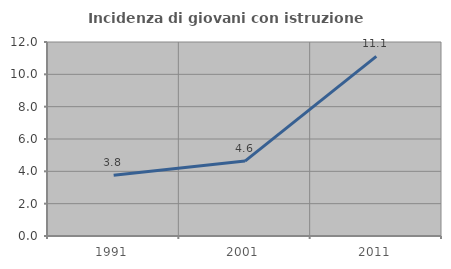
| Category | Incidenza di giovani con istruzione universitaria |
|---|---|
| 1991.0 | 3.759 |
| 2001.0 | 4.636 |
| 2011.0 | 11.111 |